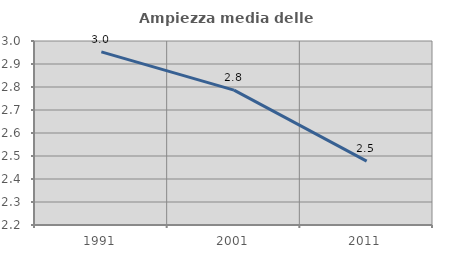
| Category | Ampiezza media delle famiglie |
|---|---|
| 1991.0 | 2.953 |
| 2001.0 | 2.786 |
| 2011.0 | 2.477 |